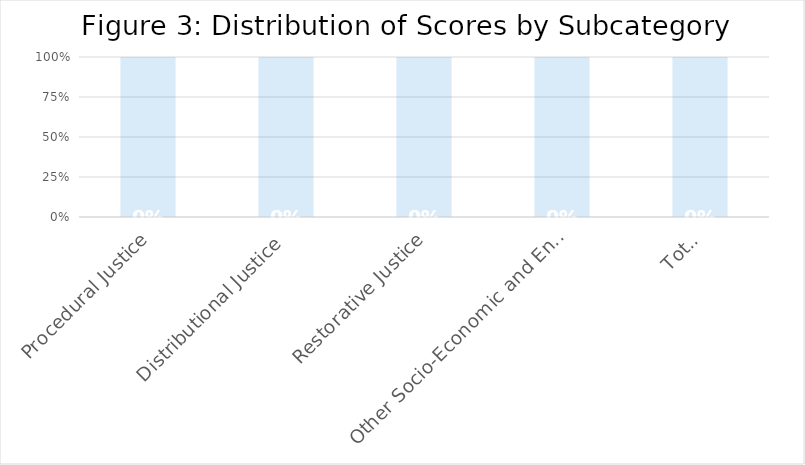
| Category | Series 0 | Series 1 |
|---|---|---|
| Procedural Justice | 0 | 1 |
| Distributional Justice | 0 | 1 |
| Restorative Justice | 0 | 1 |
| Other Socio-Economic and Environmental Factors | 0 | 1 |
| Total | 0 | 1 |